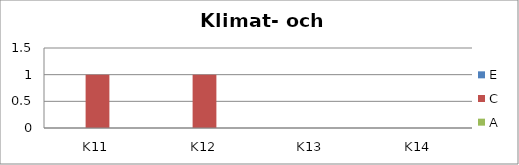
| Category | E | C | A |
|---|---|---|---|
| K11 | 0 | 1 | 0 |
| K12 | 0 | 1 | 0 |
| K13 | 0 | 0 | 0 |
| K14 | 0 | 0 | 0 |